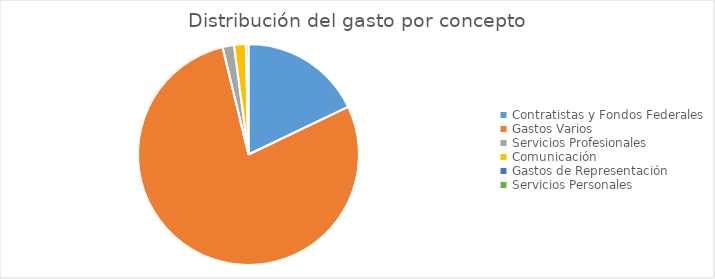
| Category | Series 0 |
|---|---|
| Contratistas y Fondos Federales | 90296134.3 |
| Gastos Varios | 395210672.94 |
| Servicios Profesionales | 8449356.45 |
| Comunicación | 8738436.41 |
| Gastos de Representación | 0 |
| Servicios Personales | 1890687.8 |